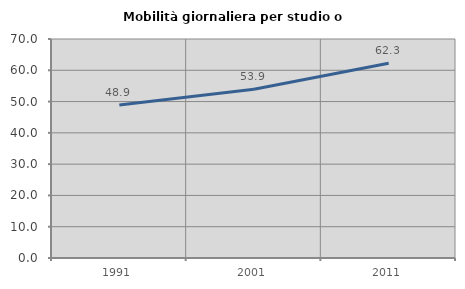
| Category | Mobilità giornaliera per studio o lavoro |
|---|---|
| 1991.0 | 48.88 |
| 2001.0 | 53.943 |
| 2011.0 | 62.279 |